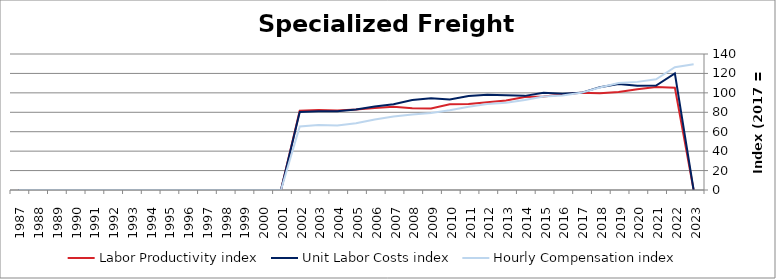
| Category | Labor Productivity index | Unit Labor Costs index | Hourly Compensation index |
|---|---|---|---|
| 2023.0 | 0 | 0 | 129.346 |
| 2022.0 | 105.317 | 120.068 | 126.452 |
| 2021.0 | 105.923 | 107.537 | 113.906 |
| 2020.0 | 103.745 | 107.288 | 111.306 |
| 2019.0 | 100.884 | 109.088 | 110.052 |
| 2018.0 | 99.692 | 105.859 | 105.533 |
| 2017.0 | 100 | 100 | 100 |
| 2016.0 | 98.198 | 99.081 | 97.296 |
| 2015.0 | 96.191 | 99.997 | 96.189 |
| 2014.0 | 95.731 | 96.896 | 92.759 |
| 2013.0 | 92.216 | 97.48 | 89.892 |
| 2012.0 | 90.246 | 97.994 | 88.435 |
| 2011.0 | 88.598 | 96.782 | 85.747 |
| 2010.0 | 88.196 | 93.204 | 82.202 |
| 2009.0 | 84.021 | 94.415 | 79.329 |
| 2008.0 | 84.073 | 92.567 | 77.824 |
| 2007.0 | 85.614 | 88.284 | 75.583 |
| 2006.0 | 84.462 | 85.938 | 72.585 |
| 2005.0 | 82.745 | 82.949 | 68.637 |
| 2004.0 | 81.815 | 81.021 | 66.287 |
| 2003.0 | 82.394 | 81.064 | 66.792 |
| 2002.0 | 81.505 | 80.234 | 65.395 |
| 2001.0 | 0 | 0 | 0 |
| 2000.0 | 0 | 0 | 0 |
| 1999.0 | 0 | 0 | 0 |
| 1998.0 | 0 | 0 | 0 |
| 1997.0 | 0 | 0 | 0 |
| 1996.0 | 0 | 0 | 0 |
| 1995.0 | 0 | 0 | 0 |
| 1994.0 | 0 | 0 | 0 |
| 1993.0 | 0 | 0 | 0 |
| 1992.0 | 0 | 0 | 0 |
| 1991.0 | 0 | 0 | 0 |
| 1990.0 | 0 | 0 | 0 |
| 1989.0 | 0 | 0 | 0 |
| 1988.0 | 0 | 0 | 0 |
| 1987.0 | 0 | 0 | 0 |